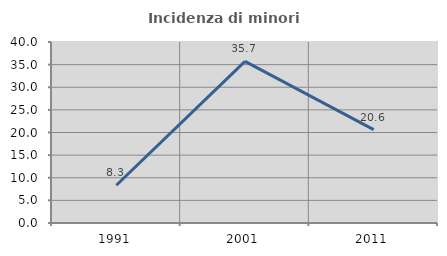
| Category | Incidenza di minori stranieri |
|---|---|
| 1991.0 | 8.333 |
| 2001.0 | 35.714 |
| 2011.0 | 20.635 |